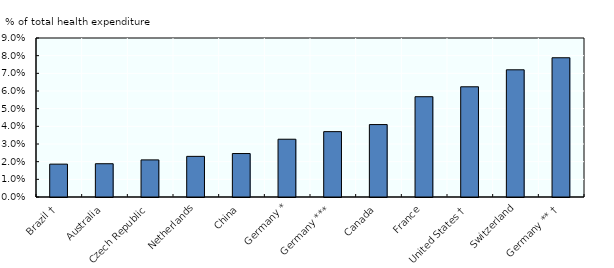
| Category | Series 0 |
|---|---|
| Brazil † | 0.019 |
| Australia | 0.019 |
| Czech Republic | 0.021 |
| Netherlands | 0.023 |
| China | 0.025 |
| Germany * | 0.033 |
| Germany *** | 0.037 |
| Canada | 0.041 |
| France | 0.057 |
| United States † | 0.062 |
| Switzerland | 0.072 |
| Germany ** † | 0.079 |